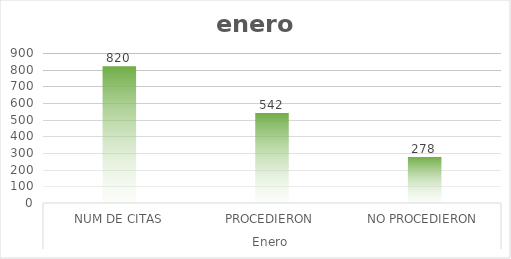
| Category | Series 0 |
|---|---|
| 0 | 820 |
| 1 | 542 |
| 2 | 278 |